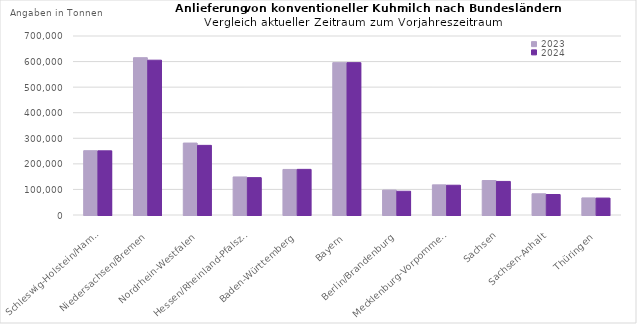
| Category | 2023 | 2024 |
|---|---|---|
| Schleswig-Holstein/Hamburg | 251482.825 | 250899.107 |
| Niedersachsen/Bremen | 615217.239 | 605374.024 |
| Nordrhein-Westfalen | 281370.782 | 272326.306 |
| Hessen/Rheinland-PfalszSaarland | 148775.665 | 146128.481 |
| Baden-Württemberg | 178155.072 | 178476.07 |
| Bayern | 595795.693 | 595872.406 |
| Berlin/Brandenburg | 97560.85 | 92898.432 |
| Mecklenburg-Vorpommern | 117910.286 | 116437.789 |
| Sachsen | 134765.906 | 131282.486 |
| Sachsen-Anhalt | 82964.3 | 80116.516 |
| Thüringen | 66744.525 | 66200.013 |